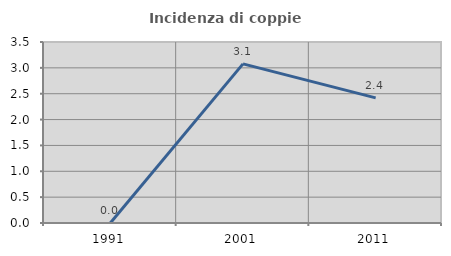
| Category | Incidenza di coppie miste |
|---|---|
| 1991.0 | 0 |
| 2001.0 | 3.077 |
| 2011.0 | 2.419 |